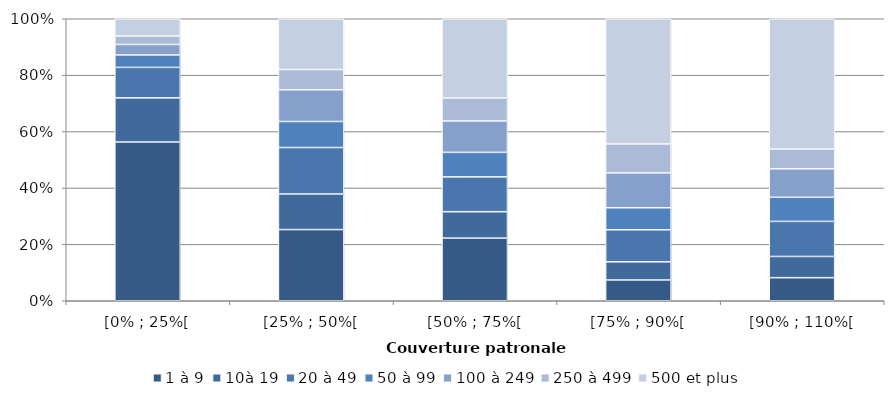
| Category | 1 à 9 | 10à 19 | 20 à 49 | 50 à 99 | 100 à 249 | 250 à 499 | 500 et plus |
|---|---|---|---|---|---|---|---|
| [0% ; 25%[ | 56.297 | 15.659 | 10.793 | 4.414 | 3.72 | 3.004 | 6.113 |
| [25% ; 50%[ | 25.242 | 12.626 | 16.468 | 9.236 | 11.244 | 7.176 | 18.004 |
| [50% ; 75%[ | 22.216 | 9.36 | 12.359 | 8.687 | 11.145 | 8.143 | 28.091 |
| [75% ; 90%[ | 7.367 | 6.445 | 11.362 | 7.802 | 12.375 | 10.258 | 44.39 |
| [90% ; 110%[ | 8.183 | 7.521 | 12.44 | 8.547 | 10.097 | 7.028 | 46.183 |